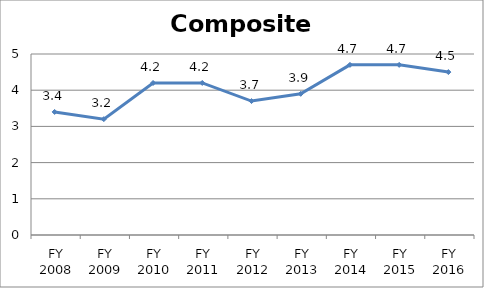
| Category | Composite score |
|---|---|
| FY 2016 | 4.5 |
| FY 2015 | 4.7 |
| FY 2014 | 4.7 |
| FY 2013 | 3.9 |
| FY 2012 | 3.7 |
| FY 2011 | 4.2 |
| FY 2010 | 4.2 |
| FY 2009 | 3.2 |
| FY 2008 | 3.4 |